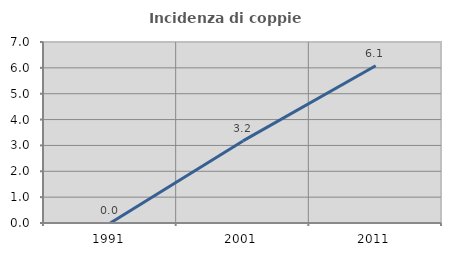
| Category | Incidenza di coppie miste |
|---|---|
| 1991.0 | 0 |
| 2001.0 | 3.175 |
| 2011.0 | 6.084 |